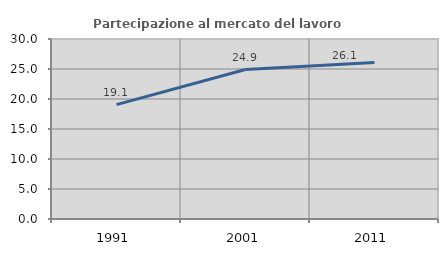
| Category | Partecipazione al mercato del lavoro  femminile |
|---|---|
| 1991.0 | 19.063 |
| 2001.0 | 24.913 |
| 2011.0 | 26.079 |